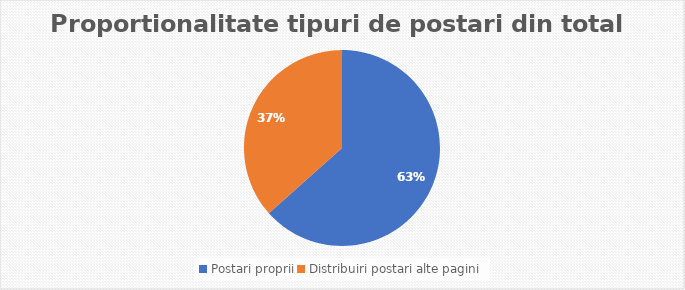
| Category | Series 0 |
|---|---|
| Postari proprii | 26 |
| Distribuiri postari alte pagini | 15 |